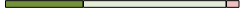
| Category | Series 0 | Series 1 | Series 2 | Series 3 |
|---|---|---|---|---|
| 0 | 6 | 11 | 1 | 0 |